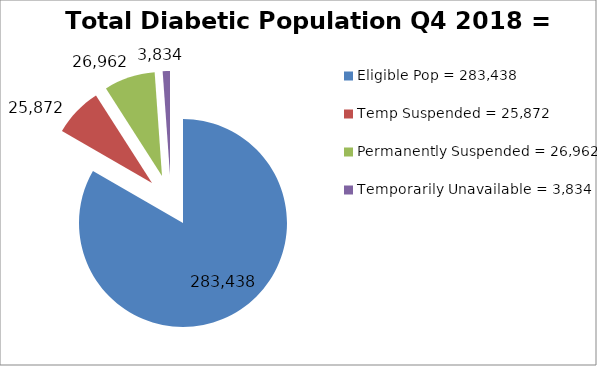
| Category | Total Diabetic Population Q4 2018 = 332,438 |
|---|---|
| Eligible Pop = 283,438 | 283438 |
| Temp Suspended = 25,872 | 25872 |
| Permanently Suspended = 26,962 | 26962 |
| Temporarily Unavailable = 3,834 | 3834 |